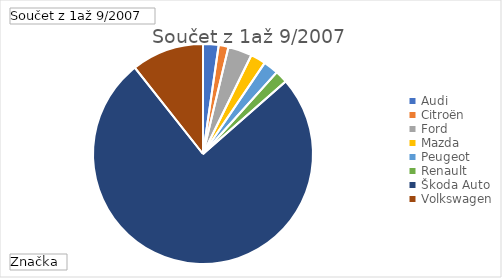
| Category | Celkem |
|---|---|
| Audi | 0.023 |
| Citroën   | 0.014 |
| Ford | 0.035 |
| Mazda | 0.022 |
| Peugeot | 0.022 |
| Renault | 0.018 |
| Škoda Auto | 0.758 |
| Volkswagen | 0.106 |